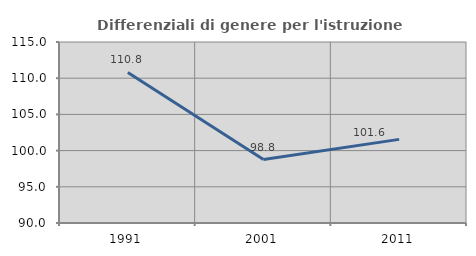
| Category | Differenziali di genere per l'istruzione superiore |
|---|---|
| 1991.0 | 110.79 |
| 2001.0 | 98.758 |
| 2011.0 | 101.551 |